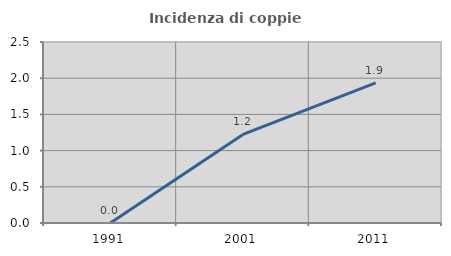
| Category | Incidenza di coppie miste |
|---|---|
| 1991.0 | 0 |
| 2001.0 | 1.224 |
| 2011.0 | 1.935 |